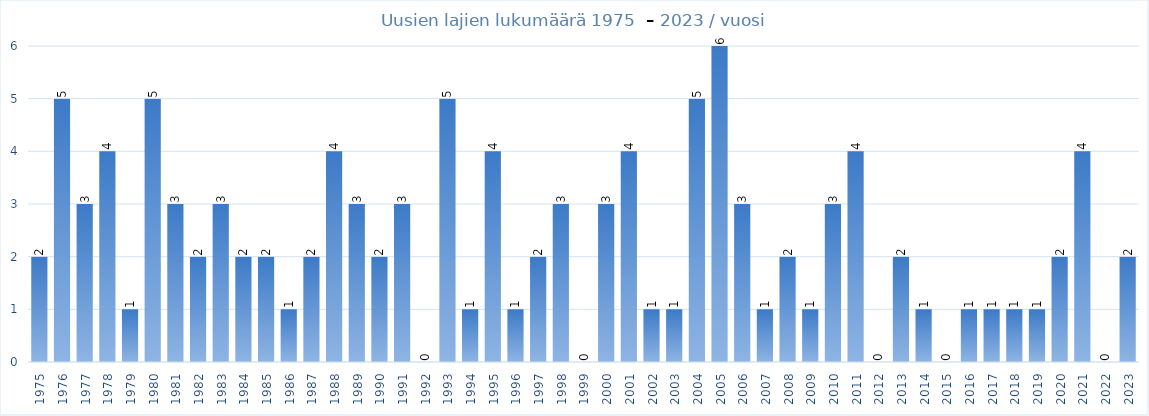
| Category | Series 0 |
|---|---|
| 1975.0 | 2 |
| 1976.0 | 5 |
| 1977.0 | 3 |
| 1978.0 | 4 |
| 1979.0 | 1 |
| 1980.0 | 5 |
| 1981.0 | 3 |
| 1982.0 | 2 |
| 1983.0 | 3 |
| 1984.0 | 2 |
| 1985.0 | 2 |
| 1986.0 | 1 |
| 1987.0 | 2 |
| 1988.0 | 4 |
| 1989.0 | 3 |
| 1990.0 | 2 |
| 1991.0 | 3 |
| 1992.0 | 0 |
| 1993.0 | 5 |
| 1994.0 | 1 |
| 1995.0 | 4 |
| 1996.0 | 1 |
| 1997.0 | 2 |
| 1998.0 | 3 |
| 1999.0 | 0 |
| 2000.0 | 3 |
| 2001.0 | 4 |
| 2002.0 | 1 |
| 2003.0 | 1 |
| 2004.0 | 5 |
| 2005.0 | 6 |
| 2006.0 | 3 |
| 2007.0 | 1 |
| 2008.0 | 2 |
| 2009.0 | 1 |
| 2010.0 | 3 |
| 2011.0 | 4 |
| 2012.0 | 0 |
| 2013.0 | 2 |
| 2014.0 | 1 |
| 2015.0 | 0 |
| 2016.0 | 1 |
| 2017.0 | 1 |
| 2018.0 | 1 |
| 2019.0 | 1 |
| 2020.0 | 2 |
| 2021.0 | 4 |
| 2022.0 | 0 |
| 2023.0 | 2 |